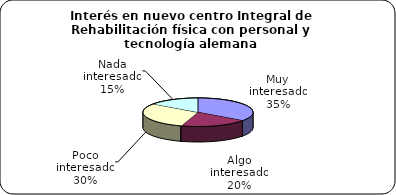
| Category | Series 0 |
|---|---|
| Muy interesado | 0.35 |
| Algo interesado | 0.2 |
| Poco interesado | 0.3 |
| Nada interesado | 0.15 |